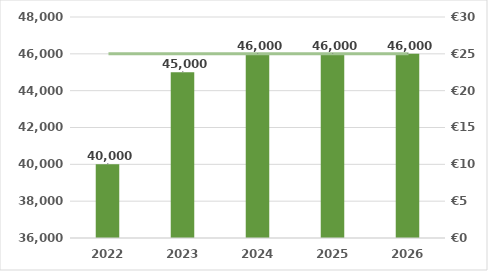
| Category | Series 0 |
|---|---|
| 2022.0 | 40000 |
| 2023.0 | 45000 |
| 2024.0 | 46000 |
| 2025.0 | 46000 |
| 2026.0 | 46000 |